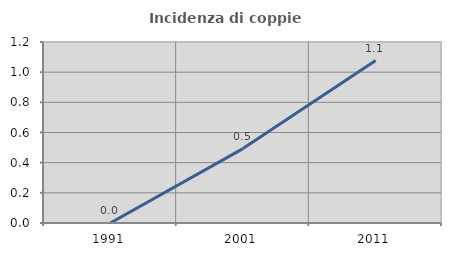
| Category | Incidenza di coppie miste |
|---|---|
| 1991.0 | 0 |
| 2001.0 | 0.493 |
| 2011.0 | 1.077 |